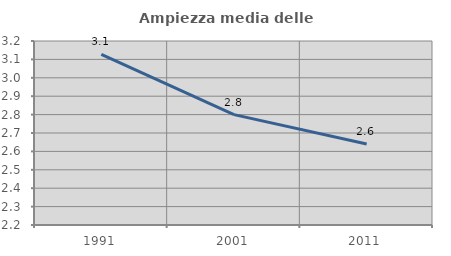
| Category | Ampiezza media delle famiglie |
|---|---|
| 1991.0 | 3.127 |
| 2001.0 | 2.8 |
| 2011.0 | 2.64 |